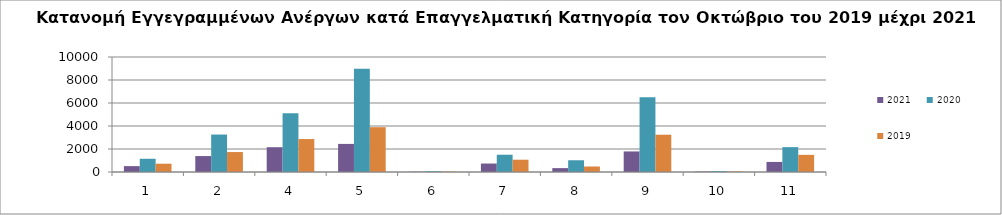
| Category | 2021 | 2020 | 2019 |
|---|---|---|---|
| 1.0 | 511 | 1150 | 721 |
| 2.0 | 1386 | 3258 | 1735 |
| 4.0 | 2155 | 5110 | 2865 |
| 5.0 | 2443 | 8968 | 3896 |
| 6.0 | 23 | 67 | 34 |
| 7.0 | 735 | 1502 | 1068 |
| 8.0 | 337 | 1021 | 479 |
| 9.0 | 1788 | 6493 | 3242 |
| 10.0 | 39 | 78 | 48 |
| 11.0 | 876 | 2161 | 1491 |